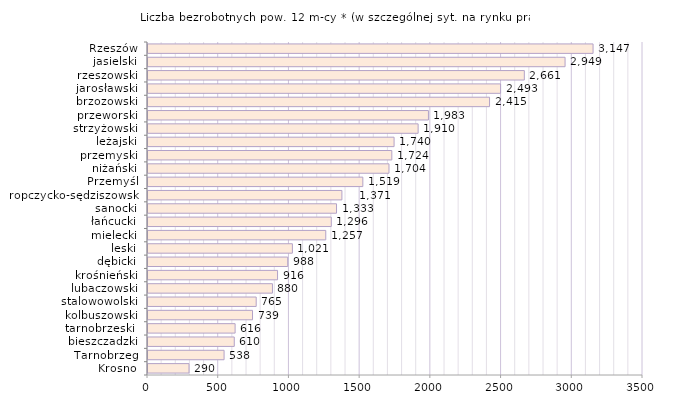
| Category | Liczba bezrobotnych powyżej 12 miesięcy* - w szczególnej sytuacji na rynku pracy |
|---|---|
| Krosno | 290 |
| Tarnobrzeg | 538 |
| bieszczadzki | 610 |
| tarnobrzeski  | 616 |
| kolbuszowski | 739 |
| stalowowolski | 765 |
| lubaczowski | 880 |
| krośnieński | 916 |
| dębicki | 988 |
| leski | 1021 |
| mielecki | 1257 |
| łańcucki | 1296 |
| sanocki | 1333 |
| ropczycko-sędziszowski | 1371 |
| Przemyśl | 1519 |
| niżański | 1704 |
| przemyski | 1724 |
| leżajski | 1740 |
| strzyżowski | 1910 |
| przeworski | 1983 |
| brzozowski | 2415 |
| jarosławski | 2493 |
| rzeszowski | 2661 |
| jasielski | 2949 |
| Rzeszów | 3147 |